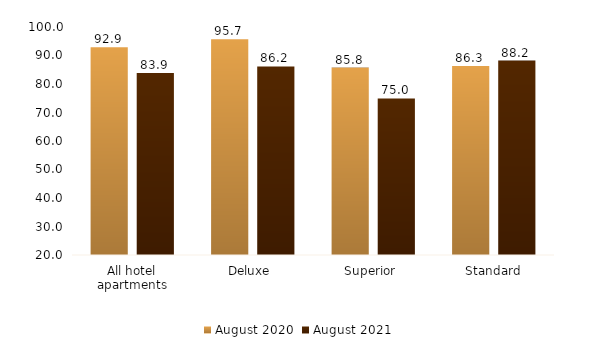
| Category | August 2020 | August 2021 |
|---|---|---|
| All hotel apartments | 92.923 | 83.901 |
| Deluxe  | 95.745 | 86.183 |
| Superior  | 85.765 | 74.951 |
| Standard | 86.326 | 88.208 |